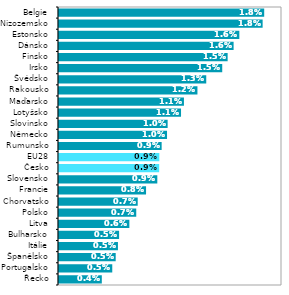
| Category | 2018* |
|---|---|
| Řecko | 0.004 |
| Portugalsko | 0.005 |
| Španělsko | 0.005 |
| Itálie | 0.005 |
| Bulharsko | 0.005 |
| Litva | 0.006 |
| Polsko | 0.007 |
| Chorvatsko | 0.007 |
| Francie | 0.008 |
| Slovensko | 0.009 |
| Česko | 0.009 |
| EU28 | 0.009 |
| Rumunsko | 0.009 |
| Německo | 0.01 |
| Slovinsko | 0.01 |
| Lotyšsko | 0.011 |
| Maďarsko | 0.011 |
| Rakousko | 0.012 |
| Švédsko | 0.013 |
| Irsko | 0.015 |
| Finsko | 0.015 |
| Dánsko | 0.016 |
| Estonsko | 0.016 |
| Nizozemsko | 0.018 |
| Belgie | 0.018 |